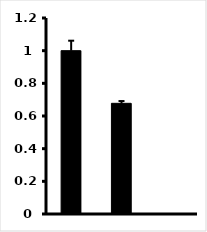
| Category | Series 0 |
|---|---|
| con | 1 |
| Def | 0.678 |
| Res | 0 |